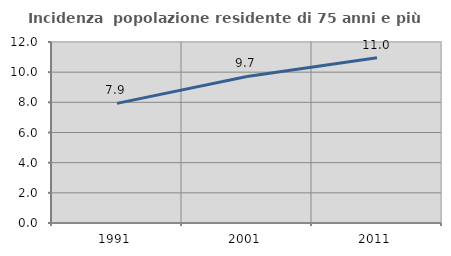
| Category | Incidenza  popolazione residente di 75 anni e più |
|---|---|
| 1991.0 | 7.931 |
| 2001.0 | 9.717 |
| 2011.0 | 10.952 |